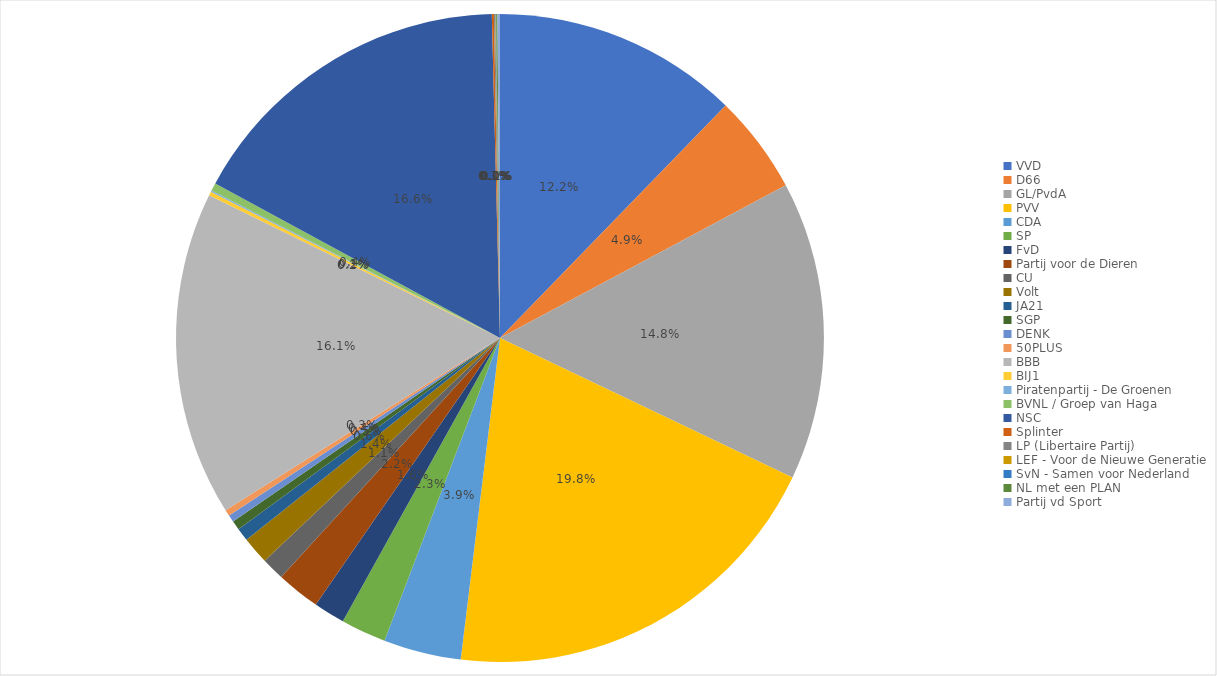
| Category | Series 0 |
|---|---|
| VVD | 0.122 |
| D66 | 0.049 |
| GL/PvdA | 0.148 |
| PVV | 0.198 |
| CDA | 0.039 |
| SP | 0.023 |
| FvD | 0.016 |
| Partij voor de Dieren | 0.022 |
| CU | 0.011 |
| Volt | 0.014 |
| JA21 | 0.006 |
| SGP | 0.005 |
| DENK | 0.004 |
| 50PLUS | 0.003 |
| BBB | 0.161 |
| BIJ1 | 0.002 |
| Piratenpartij - De Groenen | 0.001 |
| BVNL / Groep van Haga | 0.004 |
| NSC | 0.166 |
| Splinter | 0.001 |
| LP (Libertaire Partij) | 0.001 |
| LEF - Voor de Nieuwe Generatie | 0 |
| SvN - Samen voor Nederland | 0 |
| NL met een PLAN | 0.001 |
| Partij vd Sport | 0.001 |